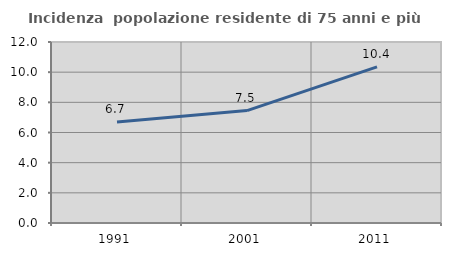
| Category | Incidenza  popolazione residente di 75 anni e più |
|---|---|
| 1991.0 | 6.694 |
| 2001.0 | 7.454 |
| 2011.0 | 10.35 |